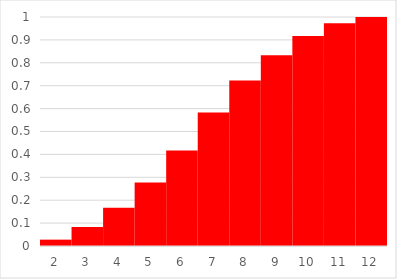
| Category | Series 0 |
|---|---|
| 2.0 | 0.028 |
| 3.0 | 0.083 |
| 4.0 | 0.167 |
| 5.0 | 0.278 |
| 6.0 | 0.417 |
| 7.0 | 0.583 |
| 8.0 | 0.722 |
| 9.0 | 0.833 |
| 10.0 | 0.917 |
| 11.0 | 0.972 |
| 12.0 | 1 |